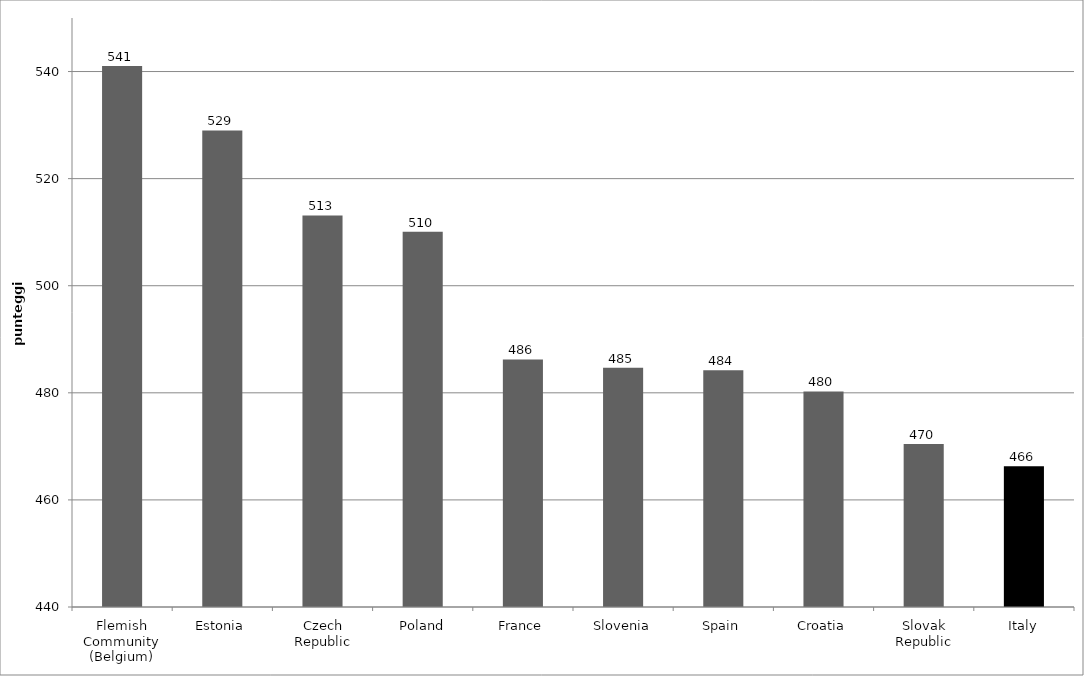
| Category | Series 0 |
|---|---|
| Flemish Community (Belgium) | 541.044 |
| Estonia | 529.007 |
| Czech Republic | 513.138 |
| Poland | 510.08 |
| France | 486.225 |
| Slovenia | 484.677 |
| Spain | 484.219 |
| Croatia | 480.265 |
| Slovak Republic | 470.423 |
| Italy | 466.3 |